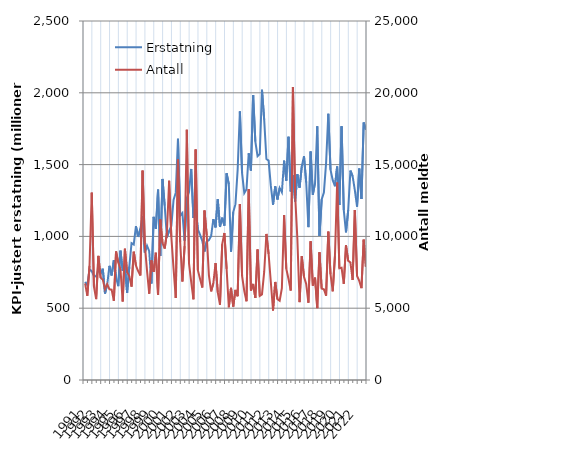
| Category | Erstatning |
|---|---|
| 1991.0 | 682.861 |
| nan | 660.593 |
| nan | 770.781 |
| nan | 757.68 |
| 1992.0 | 724.967 |
| nan | 720.337 |
| nan | 769.124 |
| nan | 738.283 |
| 1993.0 | 775.228 |
| nan | 602.058 |
| nan | 664.256 |
| nan | 794.965 |
| 1994.0 | 727.895 |
| nan | 835.014 |
| nan | 715.669 |
| nan | 653.422 |
| 1995.0 | 900.586 |
| nan | 761.203 |
| nan | 803.181 |
| nan | 605.711 |
| 1996.0 | 789.173 |
| nan | 953.39 |
| nan | 943.881 |
| nan | 1071.001 |
| 1997.0 | 996.152 |
| nan | 1053.434 |
| nan | 1142.066 |
| nan | 887.884 |
| 1998.0 | 935.373 |
| nan | 896.35 |
| nan | 671.783 |
| nan | 1136.193 |
| 1999.0 | 1052.729 |
| nan | 1325.657 |
| nan | 863.644 |
| nan | 1400.154 |
| 2000.0 | 1214.232 |
| nan | 993.707 |
| nan | 1038.895 |
| nan | 1072.169 |
| 2001.0 | 1253.265 |
| nan | 1304.559 |
| nan | 1679.765 |
| nan | 1144.776 |
| 2002.0 | 1162.727 |
| nan | 970.425 |
| nan | 1266.256 |
| nan | 1309.736 |
| 2003.0 | 1469.594 |
| nan | 1128.08 |
| nan | 1190.808 |
| nan | 1048.721 |
| 2004.0 | 1011.439 |
| nan | 967.557 |
| nan | 894.762 |
| nan | 963.959 |
| 2005.0 | 974.405 |
| nan | 1002.461 |
| nan | 1119.883 |
| nan | 1062.719 |
| 2006.0 | 1258.391 |
| nan | 1065.827 |
| nan | 1130.31 |
| nan | 1075.24 |
| 2007.0 | 1439.915 |
| nan | 1364.05 |
| nan | 893.677 |
| nan | 1169.116 |
| 2008.0 | 1224.519 |
| nan | 1465.019 |
| nan | 1870.593 |
| nan | 1441 |
| 2009.0 | 1301.099 |
| nan | 1328.36 |
| nan | 1578.846 |
| nan | 1458.773 |
| 2010.0 | 1984.188 |
| nan | 1660.479 |
| nan | 1559.014 |
| nan | 1574.052 |
| 2011.0 | 2021.055 |
| nan | 1813.246 |
| nan | 1538.78 |
| nan | 1527.545 |
| 2012.0 | 1353.017 |
| nan | 1220.672 |
| nan | 1348.959 |
| nan | 1256.877 |
| 2013.0 | 1337.311 |
| nan | 1307.667 |
| nan | 1527.592 |
| nan | 1388.401 |
| 2014.0 | 1693.847 |
| nan | 1313.108 |
| nan | 1424.554 |
| nan | 1243.361 |
| 2015.0 | 1432.487 |
| nan | 1339.063 |
| nan | 1487.095 |
| nan | 1558.19 |
| 2016.0 | 1375.58 |
| nan | 1064.405 |
| nan | 1591.137 |
| nan | 1290.489 |
| 2017.0 | 1371.785 |
| nan | 1767.479 |
| nan | 1003.271 |
| nan | 1257.841 |
| 2018.0 | 1305.9 |
| nan | 1512.06 |
| nan | 1853.654 |
| nan | 1464.441 |
| 2019.0 | 1391.758 |
| nan | 1349.421 |
| nan | 1486.971 |
| nan | 1218.36 |
| 2020.0 | 1766.411 |
| nan | 1183.175 |
| nan | 1028.68 |
| nan | 1183.099 |
| 2021.0 | 1458.431 |
| nan | 1419.051 |
| nan | 1321.794 |
| nan | 1207.092 |
| 2022.0 | 1472.703 |
| nan | 1260.294 |
| nan | 1793.257 |
| nan | 1743.276 |